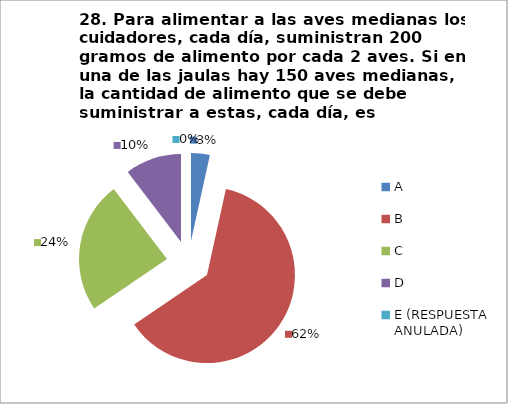
| Category | CANTIDAD DE RESPUESTAS PREGUNTA (28) | PORCENTAJE |
|---|---|---|
| A | 1 | 0.034 |
| B | 18 | 0.621 |
| C | 7 | 0.241 |
| D | 3 | 0.103 |
| E (RESPUESTA ANULADA) | 0 | 0 |